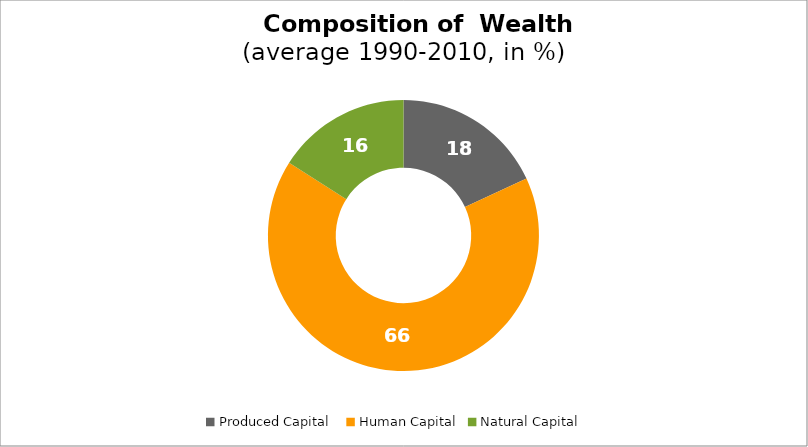
| Category | Series 0 |
|---|---|
| Produced Capital  | 18.101 |
| Human Capital | 65.908 |
| Natural Capital | 15.991 |